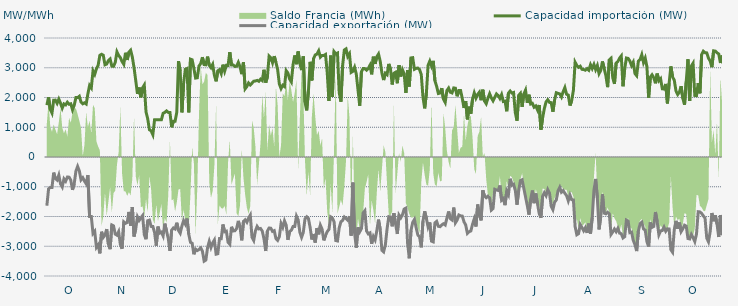
| Category | Capacidad importación (MW) | Capacidad exportación (MW) |
|---|---|---|
| 0 | 1743.75 | -1636.25 |
| 1900-01-01 | 2008.083 | -1077.083 |
| 1900-01-02 | 1602.083 | -1020.833 |
| 1900-01-03 | 1479.167 | -1022.917 |
| 1900-01-04 | 1910.417 | -525 |
| 1900-01-05 | 1912.5 | -727.083 |
| 1900-01-06 | 1804.167 | -775 |
| 1900-01-07 | 1945.833 | -608.333 |
| 1900-01-08 | 1808.333 | -904.167 |
| 1900-01-09 | 1641.667 | -1006.25 |
| 1900-01-10 | 1785.417 | -735.417 |
| 1900-01-11 | 1752.083 | -812.5 |
| 1900-01-12 | 1841.667 | -675 |
| 1900-01-13 | 1772.917 | -677.083 |
| 1900-01-14 | 1788 | -777.083 |
| 1900-01-15 | 1587.5 | -1104.167 |
| 1900-01-16 | 1737.5 | -900 |
| 1900-01-17 | 1997.917 | -475 |
| 1900-01-18 | 1995.833 | -316.667 |
| 1900-01-19 | 2041.667 | -468.75 |
| 1900-01-20 | 1843.75 | -766.667 |
| 1900-01-21 | 1787.5 | -695.833 |
| 1900-01-22 | 1820.833 | -808.333 |
| 1900-01-23 | 1781.25 | -900 |
| 1900-01-24 | 2126.667 | -608.333 |
| 1900-01-25 | 2404.417 | -2000 |
| 1900-01-26 | 2323.167 | -2000 |
| 1900-01-27 | 2893.583 | -2571.5 |
| 1900-01-28 | 2778.083 | -2500.25 |
| 1900-01-29 | 2965.5 | -3038.667 |
| 1900-01-30 | 3083.64 | -2955.48 |
| 1900-01-31 | 3418.208 | -3238.958 |
| 1900-02-01 | 3452.875 | -2513.333 |
| 1900-02-02 | 3420.292 | -2703.208 |
| 1900-02-03 | 3100.083 | -2630.333 |
| 1900-02-04 | 3123.375 | -2422.458 |
| 1900-02-05 | 3242.792 | -2928.833 |
| 1900-02-06 | 3294.958 | -3098.417 |
| 1900-02-07 | 3054.042 | -2285.333 |
| 1900-02-08 | 3047.542 | -2315.25 |
| 1900-02-09 | 3179.458 | -2592.333 |
| 1900-02-10 | 3533.833 | -2627.792 |
| 1900-02-11 | 3414 | -2509.75 |
| 1900-02-12 | 3340.25 | -2944.208 |
| 1900-02-13 | 3208.208 | -3084.875 |
| 1900-02-14 | 3116.333 | -2180.292 |
| 1900-02-15 | 3502.875 | -2231.333 |
| 1900-02-16 | 3262.542 | -2201.667 |
| 1900-02-17 | 3524.167 | -1845.708 |
| 1900-02-18 | 3589.042 | -2314 |
| 1900-02-19 | 3358.375 | -1684.042 |
| 1900-02-20 | 3002 | -2672.375 |
| 1900-02-21 | 2567.583 | -2409.375 |
| 1900-02-22 | 2121 | -2013.417 |
| 1900-02-23 | 2334.5 | -2132.333 |
| 1900-02-24 | 2006.833 | -2047.042 |
| 1900-02-25 | 2325 | -1968.542 |
| 1900-02-26 | 2420.75 | -2611.292 |
| 1900-02-27 | 1517.25 | -2763 |
| 1900-02-28 | 1283.917 | -2141.667 |
| 1900-02-28 | 916.417 | -2120.833 |
| 1900-03-01 | 879.167 | -2332.417 |
| 1900-03-02 | 750 | -2334.958 |
| 1900-03-03 | 1250 | -2536 |
| 1900-03-04 | 1250 | -2982 |
| 1900-03-05 | 1250 | -2338.583 |
| 1900-03-06 | 1250 | -2558.333 |
| 1900-03-07 | 1250 | -2526.375 |
| 1900-03-08 | 1470.833 | -2652.25 |
| 1900-03-09 | 1500 | -2239.292 |
| 1900-03-10 | 1550 | -2486.75 |
| 1900-03-11 | 1500 | -2733.5 |
| 1900-03-12 | 1500 | -3155.125 |
| 1900-03-13 | 1000 | -2458.542 |
| 1900-03-14 | 1200 | -2385.25 |
| 1900-03-15 | 1200 | -2419 |
| 1900-03-16 | 1500 | -2208.75 |
| 1900-03-17 | 3221.708 | -2468.625 |
| 1900-03-18 | 2881.375 | -2561.25 |
| 1900-03-19 | 1500 | -2320.833 |
| 1900-03-20 | 2479.75 | -2136.875 |
| 1900-03-21 | 2947.875 | -2253.917 |
| 1900-03-22 | 2974.833 | -2068.75 |
| 1900-03-23 | 1500 | -2595.083 |
| 1900-03-24 | 3289.208 | -2867.583 |
| 1900-03-25 | 3267.875 | -2898.625 |
| 1900-03-26 | 2979.083 | -3270.083 |
| 1900-03-27 | 2652.375 | -3097.333 |
| 1900-03-28 | 2663.208 | -3144.542 |
| 1900-03-29 | 3058.292 | -3107.917 |
| 1900-03-30 | 3141.958 | -3054.292 |
| 1900-03-31 | 3354.667 | -3163.833 |
| 1900-04-01 | 3106.083 | -3500.875 |
| 1900-04-02 | 3099.042 | -3464.417 |
| 1900-04-03 | 3374.208 | -3046.25 |
| 1900-04-04 | 3081.083 | -2836.417 |
| 1900-04-05 | 3002 | -3040.417 |
| 1900-04-06 | 3113.875 | -2884.417 |
| 1900-04-07 | 2746.792 | -2789.333 |
| 1900-04-08 | 2544 | -3266.167 |
| 1900-04-09 | 2896.458 | -3250.667 |
| 1900-04-10 | 2937 | -2740.375 |
| 1900-04-11 | 2803.458 | -2745 |
| 1900-04-12 | 3104.125 | -2267.833 |
| 1900-04-13 | 2884.333 | -2514.583 |
| 1900-04-14 | 3081.042 | -2493.458 |
| 1900-04-15 | 3079.083 | -2866 |
| 1900-04-16 | 3524.292 | -2932.083 |
| 1900-04-17 | 3096.5 | -2347.083 |
| 1900-04-18 | 3096.5 | -2484.875 |
| 1900-04-19 | 3044.417 | -2478.583 |
| 1900-04-20 | 3048.167 | -2403.5 |
| 1900-04-21 | 3181.083 | -2147.542 |
| 1900-04-22 | 3030.708 | -2365.833 |
| 1900-04-23 | 2784.5 | -2801.333 |
| 1900-04-24 | 3182.417 | -2165.083 |
| 1900-04-25 | 2292.583 | -2110.5 |
| 1900-04-26 | 2370.25 | -2192.75 |
| 1900-04-27 | 2487.208 | -2051.417 |
| 1900-04-28 | 2421.292 | -1952.083 |
| 1900-04-29 | 2482.917 | -2699.375 |
| 1900-04-30 | 2548.458 | -2805.375 |
| 1900-05-01 | 2554.458 | -2484.042 |
| 1900-05-02 | 2574.083 | -2331.417 |
| 1900-05-03 | 2544.458 | -2417.833 |
| 1900-05-04 | 2615.833 | -2403.25 |
| 1900-05-05 | 2568.917 | -2488.625 |
| 1900-05-06 | 2932.208 | -2748.875 |
| 1900-05-07 | 2500.875 | -3160.125 |
| 1900-05-08 | 2689.458 | -2491.667 |
| 1900-05-09 | 3392.292 | -2386.5 |
| 1900-05-10 | 3335.083 | -2392.75 |
| 1900-05-11 | 3167.5 | -2500.5 |
| 1900-05-12 | 3390.625 | -2475.917 |
| 1900-05-13 | 3180.958 | -2741.75 |
| 1900-05-14 | 2936.5 | -2801.625 |
| 1900-05-15 | 2452.792 | -2674.667 |
| 1900-05-16 | 2300.208 | -2235.25 |
| 1900-05-17 | 2411.792 | -2365.167 |
| 1900-05-18 | 2366.75 | -2147.917 |
| 1900-05-19 | 2902.042 | -2292.875 |
| 1900-05-20 | 2822.25 | -2784.375 |
| 1900-05-21 | 2619.333 | -2505.792 |
| 1900-05-22 | 2523.292 | -2462.542 |
| 1900-05-23 | 3101.75 | -2337.5 |
| 1900-05-24 | 3414.042 | -2335.5 |
| 1900-05-25 | 3119.417 | -1987.458 |
| 1900-05-26 | 3547.333 | -2114.583 |
| 1900-05-27 | 3135.708 | -2530.042 |
| 1900-05-28 | 2921.125 | -2699.333 |
| 1900-05-29 | 3380.917 | -2535.75 |
| 1900-05-30 | 1842.042 | -2078.542 |
| 1900-05-31 | 1566.833 | -2010.417 |
| 1900-06-01 | 2214.542 | -2066.667 |
| 1900-06-02 | 3198.583 | -2370 |
| 1900-06-03 | 2574 | -2772.958 |
| 1900-06-04 | 3310.583 | -2592.083 |
| 1900-06-05 | 3430.75 | -2875.542 |
| 1900-06-06 | 3458.333 | -2387.75 |
| 1900-06-07 | 3568.125 | -2599.208 |
| 1900-06-08 | 3355.708 | -2294.333 |
| 1900-06-09 | 3414.333 | -2427 |
| 1900-06-10 | 3410.542 | -2802.125 |
| 1900-06-11 | 3447.375 | -2640.958 |
| 1900-06-12 | 2831.208 | -2506.667 |
| 1900-06-13 | 1881.583 | -2434.25 |
| 1900-06-14 | 3406.708 | -2011.583 |
| 1900-06-15 | 2022.5 | -2050 |
| 1900-06-16 | 3540.875 | -2176.417 |
| 1900-06-17 | 3466.542 | -2807.167 |
| 1900-06-18 | 3493.375 | -2823.167 |
| 1900-06-19 | 2166.833 | -2382.125 |
| 1900-06-20 | 1859.958 | -2177.167 |
| 1900-06-21 | 3077.875 | -2132.833 |
| 1900-06-22 | 3595.75 | -2015.417 |
| 1900-06-23 | 3634.375 | -2069.417 |
| 1900-06-24 | 3379.833 | -2125 |
| 1900-06-25 | 3470.304 | -1991.957 |
| 1900-06-26 | 2844 | -2641.708 |
| 1900-06-27 | 2880.625 | -862.5 |
| 1900-06-28 | 3017.208 | -2558.208 |
| 1900-06-29 | 2787.708 | -3047.042 |
| 1900-06-30 | 2256.625 | -2365.667 |
| 1900-07-01 | 1722.917 | -2515.917 |
| 1900-07-02 | 2869 | -2405.667 |
| 1900-07-03 | 2973.167 | -1879.167 |
| 1900-07-04 | 2971 | -1806.25 |
| 1900-07-05 | 2919.208 | -2484.833 |
| 1900-07-06 | 2973.125 | -2583.917 |
| 1900-07-07 | 3083.25 | -2551.375 |
| 1900-07-08 | 2777.875 | -2917.292 |
| 1900-07-09 | 3371.833 | -2672.292 |
| 1900-07-10 | 3131 | -2785.25 |
| 1900-07-11 | 3368.375 | -2480.958 |
| 1900-07-12 | 3462.292 | -2105.333 |
| 1900-07-13 | 3215.917 | -2442.958 |
| 1900-07-14 | 2817.875 | -3136.917 |
| 1900-07-15 | 2586 | -3188.792 |
| 1900-07-16 | 2815 | -2954.042 |
| 1900-07-17 | 2767 | -2418.75 |
| 1900-07-18 | 3129.208 | -2005 |
| 1900-07-19 | 2953.792 | -2013.417 |
| 1900-07-20 | 2437.083 | -2329.833 |
| 1900-07-21 | 2815.958 | -1889.333 |
| 1900-07-22 | 2849.708 | -2257.667 |
| 1900-07-23 | 2479.208 | -2586.833 |
| 1900-07-24 | 3084.333 | -1954.5 |
| 1900-07-25 | 2707.042 | -2046.583 |
| 1900-07-26 | 2933.542 | -1941.667 |
| 1900-07-27 | 2795.917 | -1750 |
| 1900-07-28 | 2158.042 | -1718.75 |
| 1900-07-29 | 2918.875 | -2898.083 |
| 1900-07-30 | 2368.375 | -3404.167 |
| 1900-07-31 | 3329.75 | -2465.083 |
| 1900-08-01 | 3339.208 | -2197.25 |
| 1900-08-02 | 2948.5 | -2100.583 |
| 1900-08-03 | 2980.792 | -2371.042 |
| 1900-08-04 | 2990.708 | -2620.708 |
| 1900-08-05 | 2938.333 | -2683 |
| 1900-08-06 | 2774.542 | -3036.75 |
| 1900-08-07 | 2014.917 | -2156.292 |
| 1900-08-08 | 1635.417 | -1825.292 |
| 1900-08-09 | 2140.25 | -2060.75 |
| 1900-08-10 | 3080.917 | -2353.125 |
| 1900-08-11 | 3223.333 | -2199.083 |
| 1900-08-12 | 3058.083 | -2827.667 |
| 1900-08-13 | 3231.167 | -2853.292 |
| 1900-08-14 | 2562 | -2213.625 |
| 1900-08-15 | 2375 | -2164.25 |
| 1900-08-16 | 2133.333 | -2329.5 |
| 1900-08-17 | 2150 | -2341.083 |
| 1900-08-18 | 2314.583 | -2282 |
| 1900-08-19 | 1943.75 | -2242.25 |
| 1900-08-20 | 1835.625 | -2285.208 |
| 1900-08-21 | 2235.417 | -2055.542 |
| 1900-08-22 | 2316.667 | -1831.25 |
| 1900-08-23 | 2178.125 | -2071.583 |
| 1900-08-24 | 2154.167 | -2116.125 |
| 1900-08-25 | 2321.417 | -1699.458 |
| 1900-08-26 | 2312 | -2210.167 |
| 1900-08-27 | 2040.917 | -2118.083 |
| 1900-08-28 | 2233.083 | -1949.458 |
| 1900-08-29 | 2234.854 | -1977.083 |
| 1900-08-30 | 1964.583 | -1985.792 |
| 1900-08-31 | 1650 | -2177.417 |
| 1900-09-01 | 1877.083 | -2287.667 |
| 1900-09-02 | 1264.583 | -2568.708 |
| 1900-09-03 | 1691.667 | -2512.667 |
| 1900-09-04 | 1456.25 | -2486.333 |
| 1900-09-05 | 1945.833 | -2259.083 |
| 1900-09-06 | 2154.167 | -2079.5 |
| 1900-09-07 | 1979.167 | -2336.083 |
| 1900-09-08 | 2104.167 | -1597.917 |
| 1900-09-09 | 2179.167 | -1954.167 |
| 1900-09-10 | 1908.333 | -2131.25 |
| 1900-09-11 | 2262.5 | -1118.75 |
| 1900-09-12 | 1879.167 | -1314.583 |
| 1900-09-13 | 1791.667 | -1368 |
| 1900-09-14 | 1977.083 | -1316.667 |
| 1900-09-15 | 2127.083 | -1377.083 |
| 1900-09-16 | 1987.5 | -1785.417 |
| 1900-09-17 | 1887.5 | -1733.333 |
| 1900-09-18 | 2002.083 | -1085.417 |
| 1900-09-19 | 2118.75 | -1110.417 |
| 1900-09-20 | 2066.667 | -1125 |
| 1900-09-21 | 1966.667 | -958.333 |
| 1900-09-22 | 2097.917 | -1454.167 |
| 1900-09-23 | 1864.583 | -1397.917 |
| 1900-09-24 | 1877.083 | -1618.75 |
| 1900-09-25 | 1537.5 | -1143.75 |
| 1900-09-26 | 2145.833 | -1264 |
| 1900-09-27 | 2216.667 | -731.25 |
| 1900-09-28 | 2150 | -950 |
| 1900-09-29 | 2167.583 | -916.667 |
| 1900-09-30 | 1493.75 | -1122.25 |
| 1900-10-01 | 1220.833 | -1604.167 |
| 1900-10-02 | 2072.917 | -1125 |
| 1900-10-03 | 2139.583 | -791.667 |
| 1900-10-04 | 1687.5 | -764.583 |
| 1900-10-05 | 2116.667 | -1058.333 |
| 1900-10-06 | 2247.917 | -1337.5 |
| 1900-10-07 | 1818.75 | -1627.083 |
| 1900-10-08 | 2093.75 | -1937.5 |
| 1900-10-09 | 1781.25 | -1422.917 |
| 1900-10-10 | 1804.167 | -1127.083 |
| 1900-10-11 | 1675 | -1552.083 |
| 1900-10-12 | 1716.667 | -1225 |
| 1900-10-13 | 1583.333 | -1570.833 |
| 1900-10-14 | 1747.917 | -1904.167 |
| 1900-10-15 | 918.75 | -2042.875 |
| 1900-10-16 | 1314.583 | -1310.417 |
| 1900-10-17 | 1629.167 | -1200 |
| 1900-10-18 | 1852.083 | -1300.583 |
| 1900-10-19 | 1925 | -1095.833 |
| 1900-10-20 | 1835.417 | -1208.333 |
| 1900-10-21 | 1827.083 | -1656.25 |
| 1900-10-22 | 1522.917 | -1770.917 |
| 1900-10-23 | 1916.667 | -1518.75 |
| 1900-10-24 | 2160.417 | -1441.667 |
| 1900-10-25 | 2139.583 | -1137.5 |
| 1900-10-26 | 2120.833 | -1018.75 |
| 1900-10-27 | 2018.75 | -1183.333 |
| 1900-10-28 | 2193.75 | -1127.083 |
| 1900-10-29 | 2333.333 | -1220.833 |
| 1900-10-30 | 2108.333 | -1295.833 |
| 1900-10-31 | 2079.833 | -1472.917 |
| 1900-11-01 | 1729.167 | -1281.25 |
| 1900-11-02 | 1897.917 | -1434.542 |
| 1900-11-03 | 2247 | -1443.75 |
| 1900-11-04 | 3185.083 | -2337 |
| 1900-11-05 | 3075.167 | -2613.625 |
| 1900-11-06 | 3013.625 | -2576.5 |
| 1900-11-07 | 3052.042 | -2269.25 |
| 1900-11-08 | 2946.333 | -2370.833 |
| 1900-11-09 | 2940.542 | -2478.958 |
| 1900-11-10 | 2917.208 | -2375.625 |
| 1900-11-11 | 2971.167 | -2551.875 |
| 1900-11-12 | 2917.292 | -2238 |
| 1900-11-13 | 3101.958 | -2573.167 |
| 1900-11-14 | 2973.375 | -2041.667 |
| 1900-11-15 | 3109.875 | -1120.167 |
| 1900-11-16 | 2936.333 | -737.5 |
| 1900-11-17 | 3074.833 | -1371.667 |
| 1900-11-18 | 2802.417 | -2434.917 |
| 1900-11-19 | 2913.625 | -1996.875 |
| 1900-11-20 | 3212.125 | -1254.167 |
| 1900-11-21 | 2973 | -1887.5 |
| 1900-11-22 | 2732 | -1910.417 |
| 1900-11-23 | 2348.333 | -1858 |
| 1900-11-24 | 3266 | -1911.25 |
| 1900-11-25 | 3318.417 | -2603.917 |
| 1900-11-26 | 2666.292 | -2519.292 |
| 1900-11-27 | 2457.667 | -2420.375 |
| 1900-11-28 | 3159.917 | -2510.583 |
| 1900-11-29 | 3208.208 | -2395.833 |
| 1900-11-30 | 3322.042 | -2559.25 |
| 1900-12-01 | 3397.292 | -2579.208 |
| 1900-12-02 | 2377.292 | -2722 |
| 1900-12-03 | 2966.875 | -2678.583 |
| 1900-12-04 | 3327.583 | -2120.833 |
| 1900-12-05 | 3314.125 | -2154.167 |
| 1900-12-06 | 3229.625 | -2542.417 |
| 1900-12-07 | 3075.125 | -2524.125 |
| 1900-12-08 | 3186.833 | -2800.875 |
| 1900-12-09 | 2804.417 | -2944.208 |
| 1900-12-10 | 2733.75 | -3162.5 |
| 1900-12-11 | 3225.458 | -2491.042 |
| 1900-12-12 | 3275.667 | -2238.417 |
| 1900-12-13 | 3439.5 | -2190.417 |
| 1900-12-14 | 3175.292 | -2417.375 |
| 1900-12-15 | 3321.875 | -2458.417 |
| 1900-12-16 | 3034.917 | -2846.167 |
| 1900-12-17 | 1991.917 | -3010.667 |
| 1900-12-18 | 2685.833 | -2200.25 |
| 1900-12-19 | 2763.167 | -2365.208 |
| 1900-12-20 | 2664.875 | -2334.375 |
| 1900-12-21 | 2477.792 | -1849.417 |
| 1900-12-22 | 2804.25 | -2175.083 |
| 1900-12-23 | 2563.458 | -2614.833 |
| 1900-12-24 | 2629.917 | -2484.333 |
| 1900-12-25 | 2292 | -2469.792 |
| 1900-12-26 | 2284.542 | -2356.917 |
| 1900-12-27 | 2456.5 | -2494.792 |
| 1900-12-28 | 1801.792 | -2413.833 |
| 1900-12-29 | 2484.917 | -2419 |
| 1900-12-30 | 3043.312 | -3116.896 |
| 1900-12-31 | 2693.417 | -3201.125 |
| 1901-01-01 | 2579.5 | -2439 |
| 1901-01-02 | 2220.833 | -2146.167 |
| 1901-01-03 | 2100 | -2410.292 |
| 1901-01-04 | 2179.167 | -2202.083 |
| 1901-01-05 | 2381.25 | -2508.5 |
| 1901-01-06 | 1970.833 | -2414.375 |
| 1901-01-07 | 1758.333 | -2292.792 |
| 1901-01-08 | 2544 | -2324.083 |
| 1901-01-09 | 3285.125 | -2739.75 |
| 1901-01-10 | 1885.375 | -2754.917 |
| 1901-01-11 | 3057.958 | -2601 |
| 1901-01-12 | 3152.583 | -2708.375 |
| 1901-01-13 | 2068.833 | -2840.833 |
| 1901-01-14 | 2060.917 | -2586.417 |
| 1901-01-15 | 2484.25 | -1839.417 |
| 1901-01-16 | 2141.208 | -1845.833 |
| 1901-01-17 | 3445.375 | -1893.75 |
| 1901-01-18 | 3555.25 | -1979.583 |
| 1901-01-19 | 3506.875 | -2054.167 |
| 1901-01-20 | 3499.292 | -2730 |
| 1901-01-21 | 3321.917 | -2848.375 |
| 1901-01-22 | 3225.583 | -2505.583 |
| 1901-01-23 | 3019.583 | -1882.958 |
| 1901-01-24 | 3568.667 | -2157.833 |
| 1901-01-25 | 3559.375 | -1957.75 |
| 1901-01-26 | 3503.125 | -2252.375 |
| 1901-01-27 | 3464.458 | -2689.458 |
| 1901-01-28 | 3159.52 | -1949.52 |
| 1901-01-29 | 3414.875 | -2624.75 |